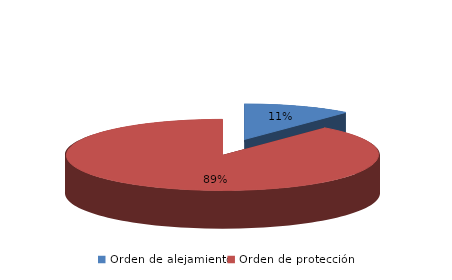
| Category | Series 0 |
|---|---|
| Orden de alejamiento | 24 |
| Orden de protección | 191 |